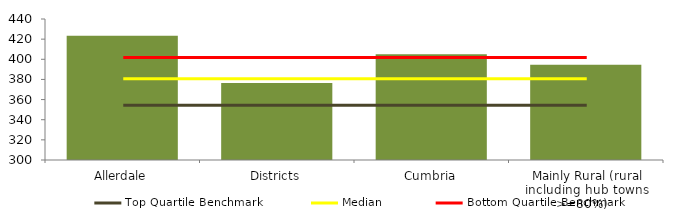
| Category | Block Data |
|---|---|
| Allerdale | 423.4 |
| Districts | 376.412 |
| Cumbria | 404.95 |
|  Mainly Rural (rural including hub towns >=80%)   | 394.57 |